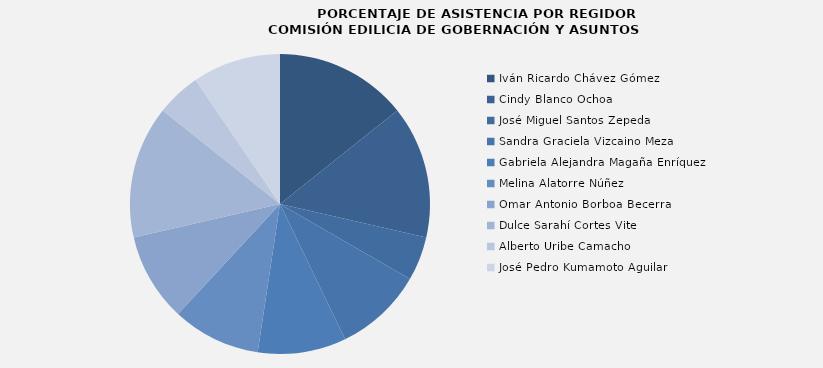
| Category | Iván Ricardo Chávez Gómez  |
|---|---|
| Iván Ricardo Chávez Gómez  | 100 |
| Cindy Blanco Ochoa | 100 |
| José Miguel Santos Zepeda | 33.333 |
| Sandra Graciela Vizcaino Meza | 66.667 |
| Gabriela Alejandra Magaña Enríquez | 66.667 |
| Melina Alatorre Núñez | 66.667 |
| Omar Antonio Borboa Becerra | 66.667 |
| Dulce Sarahí Cortes Vite | 100 |
| Alberto Uribe Camacho | 33.333 |
| José Pedro Kumamoto Aguilar | 66.667 |